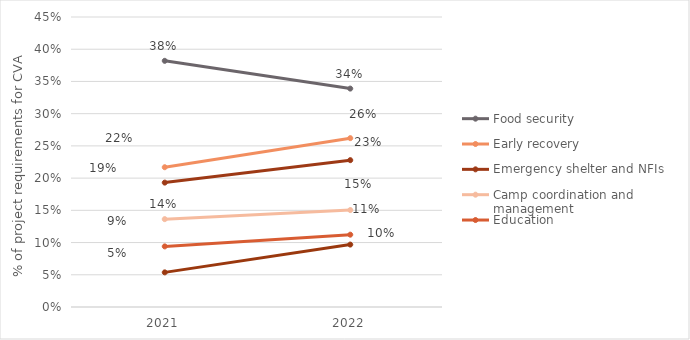
| Category | Food security | Early recovery | Emergency shelter and NFIs | Camp coordination and management | Education | Protection |
|---|---|---|---|---|---|---|
| 2021.0 | 0.382 | 0.217 | 0.193 | 0.136 | 0.094 | 0.054 |
| 2022.0 | 0.339 | 0.262 | 0.228 | 0.15 | 0.112 | 0.097 |